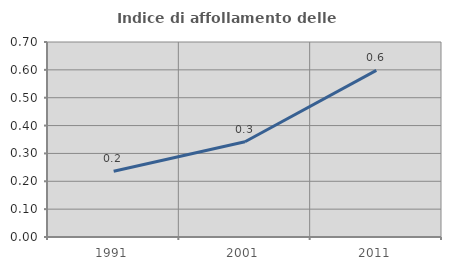
| Category | Indice di affollamento delle abitazioni  |
|---|---|
| 1991.0 | 0.236 |
| 2001.0 | 0.342 |
| 2011.0 | 0.598 |